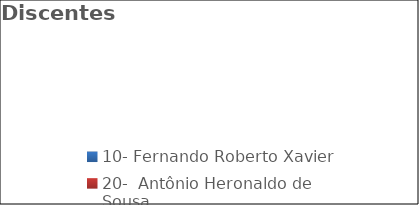
| Category | Discentes  |
|---|---|
| 10- Fernando Roberto Xavier  | 0 |
| 20-  Antônio Heronaldo de Sousa | 0 |